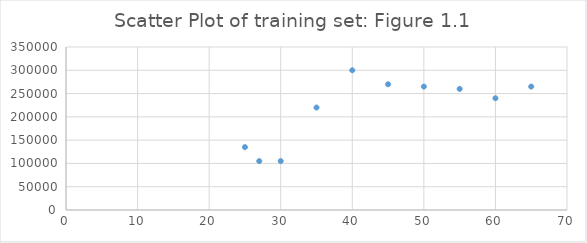
| Category | Series 0 |
|---|---|
| 25.0 | 135000 |
| 55.0 | 260000 |
| 27.0 | 105000 |
| 35.0 | 220000 |
| 60.0 | 240000 |
| 65.0 | 265000 |
| 45.0 | 270000 |
| 40.0 | 300000 |
| 50.0 | 265000 |
| 30.0 | 105000 |